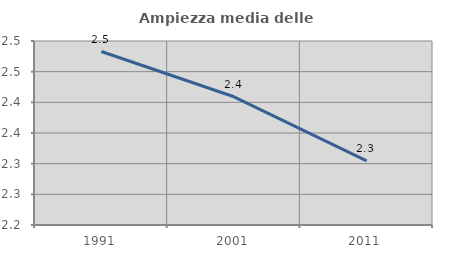
| Category | Ampiezza media delle famiglie |
|---|---|
| 1991.0 | 2.483 |
| 2001.0 | 2.409 |
| 2011.0 | 2.305 |